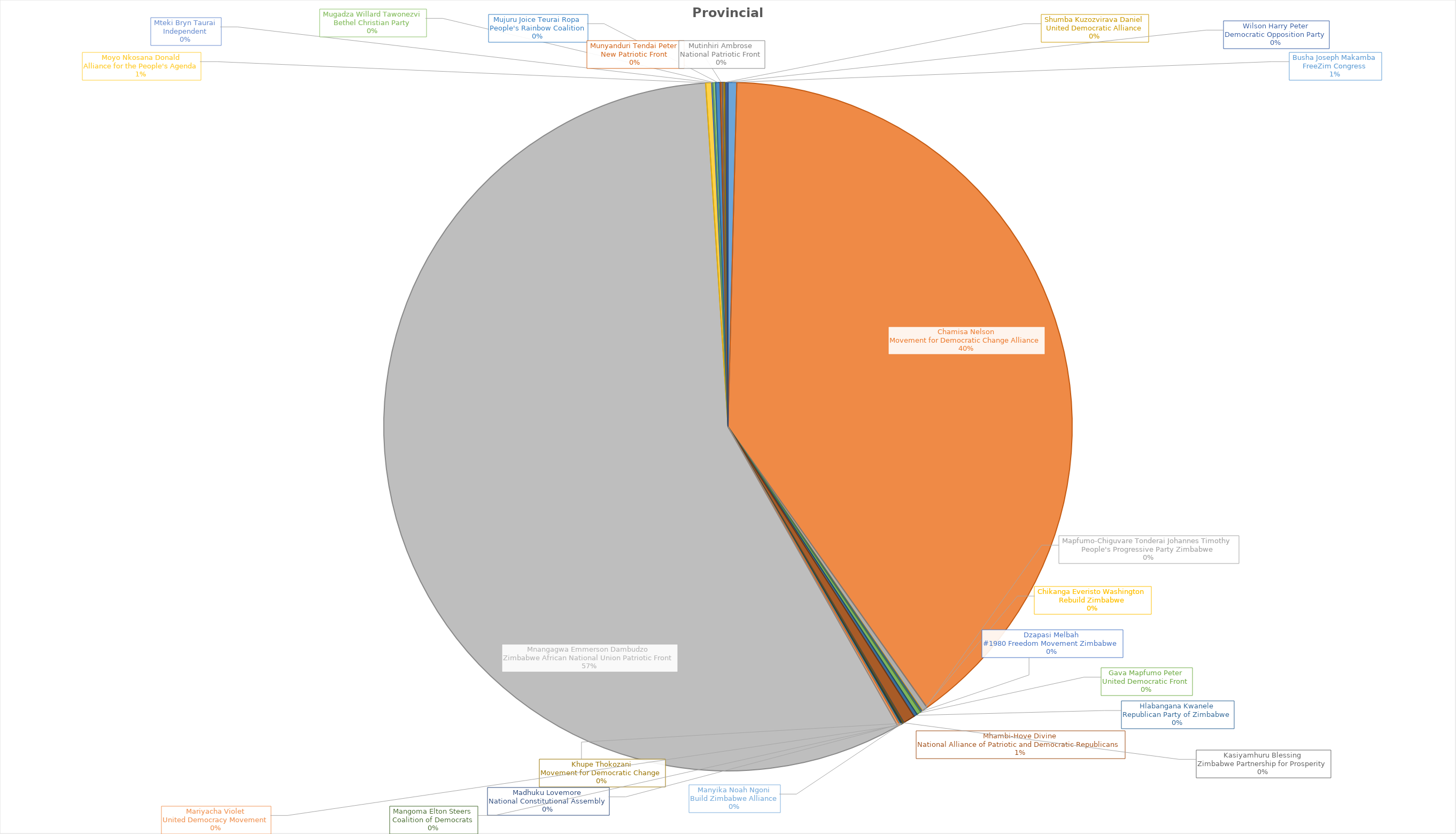
| Category | Provincial Total |
|---|---|
| Busha Joseph Makamba
FreeZim Congress | 2233 |
| Chamisa Nelson
Movement for Democratic Change Alliance | 217732 |
| Mapfumo-Chiguvare Tonderai Johannes Timothy
People's Progressive Party Zimbabwe | 1435 |
| Chikanga Everisto Washington
Rebuild Zimbabwe | 202 |
| Dzapasi Melbah
#1980 Freedom Movement Zimbabwe | 336 |
| Gava Mapfumo Peter
United Democratic Front | 1080 |
| Hlabangana Kwanele
Republican Party of Zimbabwe | 915 |
| Mhambi-Hove Divine
National Alliance of Patriotic and Democratic Republicans | 3000 |
| Kasiyamhuru Blessing
Zimbabwe Partnership for Prosperity | 259 |
| Khupe Thokozani
Movement for Democratic Change | 267 |
| Madhuku Lovemore
National Constitutional Assembly | 263 |
| Mangoma Elton Steers
Coalition of Democrats | 215 |
| Manyika Noah Ngoni
Build Zimbabwe Alliance | 201 |
| Mariyacha Violet
United Democracy Movement | 581 |
| Mnangagwa Emmerson Dambudzo
Zimbabwe African National Union Patriotic Front | 312958 |
| Moyo Nkosana Donald
Alliance for the People's Agenda | 1540 |
| Mteki Bryn Taurai
Independent | 324 |
| Mugadza Willard Tawonezvi
Bethel Christian Party | 660 |
| Mujuru Joice Teurai Ropa
People's Rainbow Coalition | 1152 |
| Munyanduri Tendai Peter
New Patriotic Front | 544 |
| Mutinhiri Ambrose
National Patriotic Front | 455 |
| Shumba Kuzozvirava Daniel
United Democratic Alliance | 426 |
| Wilson Harry Peter
Democratic Opposition Party | 572 |